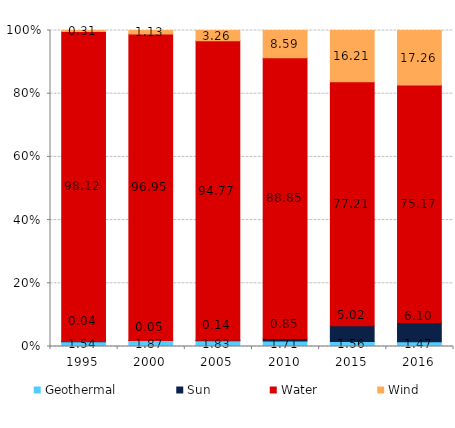
| Category | Geothermal | Sun | Water | Wind |
|---|---|---|---|---|
| 1995.0 | 1.536 | 0.039 | 98.118 | 0.306 |
| 2000.0 | 1.867 | 0.054 | 96.954 | 1.126 |
| 2005.0 | 1.829 | 0.141 | 94.768 | 3.262 |
| 2010.0 | 1.713 | 0.851 | 88.85 | 8.586 |
| 2015.0 | 1.556 | 5.023 | 77.209 | 16.212 |
| 2016.0 | 1.472 | 6.1 | 75.169 | 17.259 |